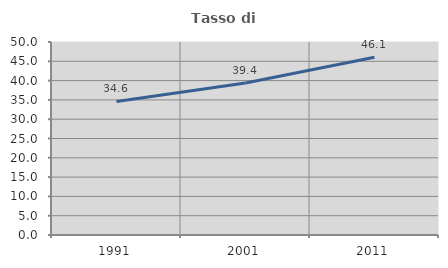
| Category | Tasso di occupazione   |
|---|---|
| 1991.0 | 34.59 |
| 2001.0 | 39.392 |
| 2011.0 | 46.067 |